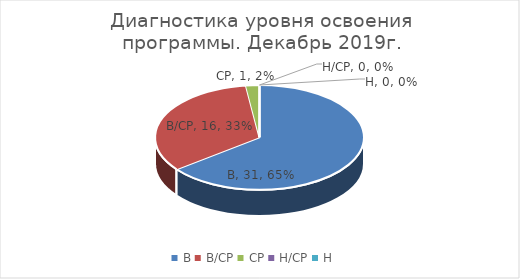
| Category | Золотая рыбка |
|---|---|
| В | 31 |
| В/СР | 16 |
| СР | 1 |
| Н/СР | 0 |
| Н | 0 |